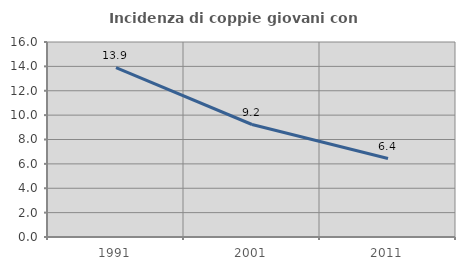
| Category | Incidenza di coppie giovani con figli |
|---|---|
| 1991.0 | 13.901 |
| 2001.0 | 9.231 |
| 2011.0 | 6.438 |